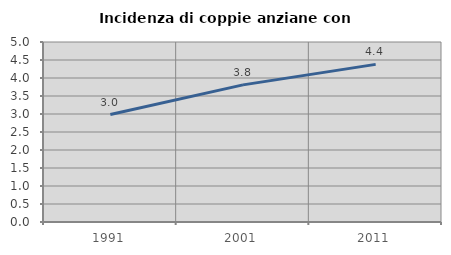
| Category | Incidenza di coppie anziane con figli |
|---|---|
| 1991.0 | 2.986 |
| 2001.0 | 3.809 |
| 2011.0 | 4.379 |